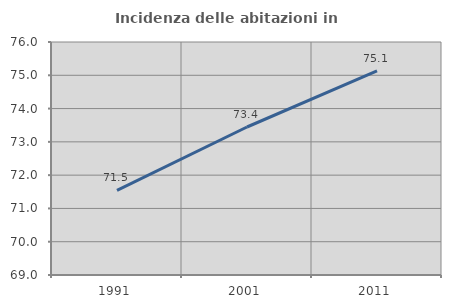
| Category | Incidenza delle abitazioni in proprietà  |
|---|---|
| 1991.0 | 71.543 |
| 2001.0 | 73.446 |
| 2011.0 | 75.13 |